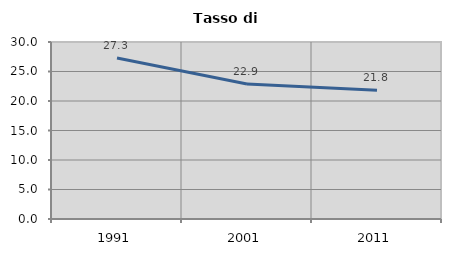
| Category | Tasso di disoccupazione   |
|---|---|
| 1991.0 | 27.273 |
| 2001.0 | 22.888 |
| 2011.0 | 21.836 |